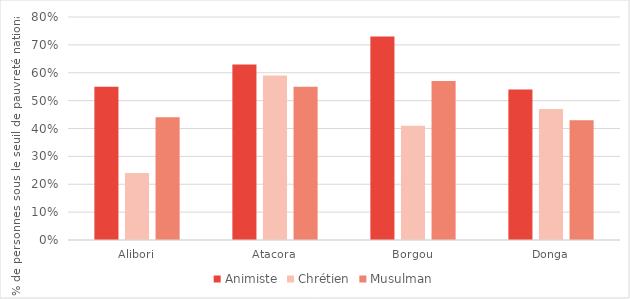
| Category | Animiste | Chrétien | Musulman |
|---|---|---|---|
| Alibori | 0.55 | 0.24 | 0.44 |
| Atacora | 0.63 | 0.59 | 0.55 |
| Borgou | 0.73 | 0.41 | 0.57 |
| Donga | 0.54 | 0.47 | 0.43 |